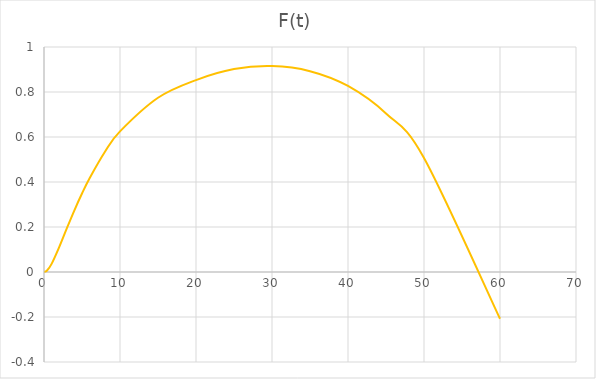
| Category | F(t) |
|---|---|
| 0.0 | 0 |
| 0.4 | 0.007 |
| 1.0 | 0.036 |
| 2.0 | 0.111 |
| 3.0 | 0.194 |
| 4.0 | 0.274 |
| 5.0 | 0.349 |
| 6.0 | 0.417 |
| 8.0 | 0.533 |
| 10.0 | 0.625 |
| 15.0 | 0.774 |
| 20.0 | 0.853 |
| 25.0 | 0.902 |
| 30.0 | 0.915 |
| 35.0 | 0.893 |
| 40.0 | 0.827 |
| 45.0 | 0.704 |
| 50.0 | 0.507 |
| 60.0 | -0.208 |